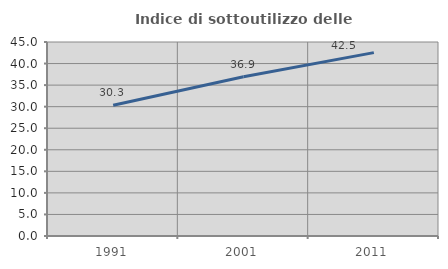
| Category | Indice di sottoutilizzo delle abitazioni  |
|---|---|
| 1991.0 | 30.334 |
| 2001.0 | 36.936 |
| 2011.0 | 42.535 |